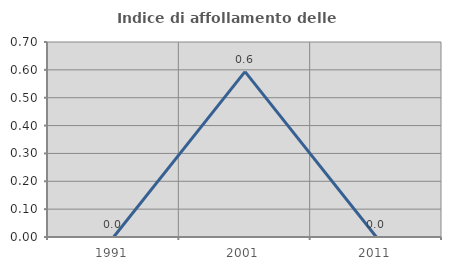
| Category | Indice di affollamento delle abitazioni  |
|---|---|
| 1991.0 | 0 |
| 2001.0 | 0.593 |
| 2011.0 | 0 |